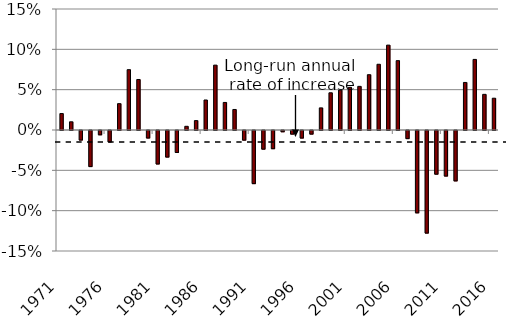
| Category | Series 0 |
|---|---|
| 1971.0 | 0.02 |
| nan | 0.014 |
| nan | 0.011 |
| nan | 0.015 |
| nan | 0.013 |
| nan | 0.014 |
| nan | 0.016 |
| nan | 0.007 |
| nan | 0.005 |
| nan | 0.005 |
| nan | 0.013 |
| nan | 0.009 |
| 1972.0 | 0.01 |
| nan | 0.013 |
| nan | 0.012 |
| nan | 0.01 |
| nan | 0.009 |
| nan | 0.009 |
| nan | 0.016 |
| nan | 0.016 |
| nan | 0.011 |
| nan | 0.004 |
| nan | -0.005 |
| nan | -0.004 |
| 1973.0 | -0.012 |
| nan | -0.016 |
| nan | -0.022 |
| nan | -0.027 |
| nan | -0.033 |
| nan | -0.041 |
| nan | -0.048 |
| nan | -0.058 |
| nan | -0.054 |
| nan | -0.05 |
| nan | -0.05 |
| nan | -0.049 |
| 1974.0 | -0.045 |
| nan | -0.043 |
| nan | -0.036 |
| nan | -0.03 |
| nan | -0.033 |
| nan | -0.031 |
| nan | -0.031 |
| nan | -0.025 |
| nan | -0.029 |
| nan | -0.029 |
| nan | -0.028 |
| nan | -0.02 |
| 1975.0 | -0.005 |
| nan | -0.007 |
| nan | -0.006 |
| nan | -0.007 |
| nan | -0.003 |
| nan | -0.008 |
| nan | -0.011 |
| nan | -0.003 |
| nan | 0.003 |
| nan | 0.007 |
| nan | 0.007 |
| nan | -0.002 |
| 1976.0 | -0.014 |
| nan | -0.01 |
| nan | -0.002 |
| nan | 0.007 |
| nan | 0.015 |
| nan | 0.021 |
| nan | 0.03 |
| nan | 0.027 |
| nan | 0.026 |
| nan | 0.022 |
| nan | 0.027 |
| nan | 0.033 |
| 1977.0 | 0.033 |
| nan | 0.035 |
| nan | 0.036 |
| nan | 0.039 |
| nan | 0.042 |
| nan | 0.045 |
| nan | 0.047 |
| nan | 0.053 |
| nan | 0.059 |
| nan | 0.07 |
| nan | 0.072 |
| nan | 0.073 |
| 1978.0 | 0.075 |
| nan | 0.079 |
| nan | 0.077 |
| nan | 0.072 |
| nan | 0.069 |
| nan | 0.073 |
| nan | 0.074 |
| nan | 0.077 |
| nan | 0.069 |
| nan | 0.06 |
| nan | 0.06 |
| nan | 0.062 |
| 1979.0 | 0.063 |
| nan | 0.058 |
| nan | 0.056 |
| nan | 0.052 |
| nan | 0.048 |
| nan | 0.045 |
| nan | 0.038 |
| nan | 0.029 |
| nan | 0.024 |
| nan | 0.024 |
| nan | 0.016 |
| nan | 0.004 |
| 1980.0 | -0.009 |
| nan | -0.018 |
| nan | -0.028 |
| nan | -0.031 |
| nan | -0.035 |
| nan | -0.041 |
| nan | -0.034 |
| nan | -0.036 |
| nan | -0.037 |
| nan | -0.043 |
| nan | -0.045 |
| nan | -0.046 |
| 1981.0 | -0.042 |
| nan | -0.039 |
| nan | -0.034 |
| nan | -0.03 |
| nan | -0.028 |
| nan | -0.026 |
| nan | -0.038 |
| nan | -0.039 |
| nan | -0.043 |
| nan | -0.039 |
| nan | -0.038 |
| nan | -0.035 |
| 1982.0 | -0.033 |
| nan | -0.028 |
| nan | -0.027 |
| nan | -0.032 |
| nan | -0.039 |
| nan | -0.048 |
| nan | -0.048 |
| nan | -0.048 |
| nan | -0.042 |
| nan | -0.044 |
| nan | -0.039 |
| nan | -0.031 |
| 1983.0 | -0.027 |
| nan | -0.022 |
| nan | -0.018 |
| nan | -0.018 |
| nan | -0.011 |
| nan | 0.003 |
| nan | 0.011 |
| nan | 0.015 |
| nan | 0.014 |
| nan | 0.016 |
| nan | 0.013 |
| nan | 0.009 |
| 1984.0 | 0.005 |
| nan | -0.001 |
| nan | -0.003 |
| nan | 0 |
| nan | 0.005 |
| nan | 0.006 |
| nan | 0.006 |
| nan | 0.005 |
| nan | 0.006 |
| nan | 0.006 |
| nan | 0.006 |
| nan | 0.007 |
| 1985.0 | 0.012 |
| nan | 0.013 |
| nan | 0.012 |
| nan | 0.014 |
| nan | 0.014 |
| nan | 0.016 |
| nan | 0.019 |
| nan | 0.024 |
| nan | 0.029 |
| nan | 0.032 |
| nan | 0.035 |
| nan | 0.035 |
| 1986.0 | 0.037 |
| nan | 0.046 |
| nan | 0.057 |
| nan | 0.067 |
| nan | 0.07 |
| nan | 0.07 |
| nan | 0.075 |
| nan | 0.076 |
| nan | 0.076 |
| nan | 0.078 |
| nan | 0.08 |
| nan | 0.084 |
| 1987.0 | 0.08 |
| nan | 0.074 |
| nan | 0.062 |
| nan | 0.053 |
| nan | 0.051 |
| nan | 0.054 |
| nan | 0.049 |
| nan | 0.044 |
| nan | 0.041 |
| nan | 0.038 |
| nan | 0.036 |
| nan | 0.033 |
| 1988.0 | 0.034 |
| nan | 0.034 |
| nan | 0.035 |
| nan | 0.034 |
| nan | 0.034 |
| nan | 0.032 |
| nan | 0.031 |
| nan | 0.031 |
| nan | 0.03 |
| nan | 0.029 |
| nan | 0.029 |
| nan | 0.027 |
| 1989.0 | 0.025 |
| nan | 0.024 |
| nan | 0.022 |
| nan | 0.02 |
| nan | 0.015 |
| nan | 0.013 |
| nan | 0.01 |
| nan | 0.009 |
| nan | 0.009 |
| nan | 0.005 |
| nan | 0.001 |
| nan | -0.003 |
| 1990.0 | -0.012 |
| nan | -0.016 |
| nan | -0.019 |
| nan | -0.017 |
| nan | -0.016 |
| nan | -0.022 |
| nan | -0.027 |
| nan | -0.038 |
| nan | -0.048 |
| nan | -0.054 |
| nan | -0.061 |
| nan | -0.064 |
| 1991.0 | -0.066 |
| nan | -0.067 |
| nan | -0.067 |
| nan | -0.068 |
| nan | -0.066 |
| nan | -0.06 |
| nan | -0.055 |
| nan | -0.048 |
| nan | -0.041 |
| nan | -0.036 |
| nan | -0.033 |
| nan | -0.031 |
| 1992.0 | -0.023 |
| nan | -0.022 |
| nan | -0.022 |
| nan | -0.021 |
| nan | -0.021 |
| nan | -0.026 |
| nan | -0.028 |
| nan | -0.029 |
| nan | -0.028 |
| nan | -0.027 |
| nan | -0.023 |
| nan | -0.02 |
| 1993.0 | -0.023 |
| nan | -0.023 |
| nan | -0.023 |
| nan | -0.024 |
| nan | -0.023 |
| nan | -0.017 |
| nan | -0.012 |
| nan | -0.009 |
| nan | -0.006 |
| nan | -0.007 |
| nan | -0.006 |
| nan | -0.006 |
| 1994.0 | -0.002 |
| nan | -0.001 |
| nan | 0.001 |
| nan | 0.003 |
| nan | 0.005 |
| nan | 0.003 |
| nan | 0 |
| nan | -0.001 |
| nan | -0.002 |
| nan | 0.001 |
| nan | -0.001 |
| nan | -0.002 |
| 1995.0 | -0.004 |
| nan | -0.006 |
| nan | -0.006 |
| nan | -0.009 |
| nan | -0.013 |
| nan | -0.013 |
| nan | -0.01 |
| nan | -0.009 |
| nan | -0.008 |
| nan | -0.01 |
| nan | -0.007 |
| nan | -0.007 |
| 1996.0 | -0.009 |
| nan | -0.009 |
| nan | -0.008 |
| nan | -0.007 |
| nan | -0.005 |
| nan | -0.003 |
| nan | -0.005 |
| nan | -0.004 |
| nan | -0.006 |
| nan | -0.006 |
| nan | -0.009 |
| nan | -0.009 |
| 1997.0 | -0.004 |
| nan | -0.003 |
| nan | 0 |
| nan | 0.002 |
| nan | 0.005 |
| nan | 0.005 |
| nan | 0.007 |
| nan | 0.008 |
| nan | 0.009 |
| nan | 0.012 |
| nan | 0.018 |
| nan | 0.023 |
| 1998.0 | 0.027 |
| nan | 0.03 |
| nan | 0.033 |
| nan | 0.035 |
| nan | 0.036 |
| nan | 0.039 |
| nan | 0.041 |
| nan | 0.044 |
| nan | 0.047 |
| nan | 0.049 |
| nan | 0.048 |
| nan | 0.047 |
| 1999.0 | 0.046 |
| nan | 0.047 |
| nan | 0.047 |
| nan | 0.043 |
| nan | 0.045 |
| nan | 0.048 |
| nan | 0.047 |
| nan | 0.047 |
| nan | 0.045 |
| nan | 0.048 |
| nan | 0.048 |
| nan | 0.049 |
| 2000.0 | 0.049 |
| nan | 0.047 |
| nan | 0.044 |
| nan | 0.053 |
| nan | 0.053 |
| nan | 0.049 |
| nan | 0.049 |
| nan | 0.052 |
| nan | 0.052 |
| nan | 0.053 |
| nan | 0.055 |
| nan | 0.057 |
| 2001.0 | 0.053 |
| nan | 0.053 |
| nan | 0.057 |
| nan | 0.051 |
| nan | 0.044 |
| nan | 0.046 |
| nan | 0.052 |
| nan | 0.051 |
| nan | 0.05 |
| nan | 0.051 |
| nan | 0.05 |
| nan | 0.05 |
| 2002.0 | 0.054 |
| nan | 0.054 |
| nan | 0.053 |
| nan | 0.054 |
| nan | 0.064 |
| nan | 0.069 |
| nan | 0.067 |
| nan | 0.065 |
| nan | 0.071 |
| nan | 0.069 |
| nan | 0.07 |
| nan | 0.07 |
| 2003.0 | 0.069 |
| nan | 0.066 |
| nan | 0.064 |
| nan | 0.071 |
| nan | 0.069 |
| nan | 0.066 |
| nan | 0.066 |
| nan | 0.067 |
| nan | 0.068 |
| nan | 0.072 |
| nan | 0.077 |
| nan | 0.078 |
| 2004.0 | 0.081 |
| nan | 0.088 |
| nan | 0.095 |
| nan | 0.095 |
| nan | 0.092 |
| nan | 0.094 |
| nan | 0.099 |
| nan | 0.102 |
| nan | 0.104 |
| nan | 0.098 |
| nan | 0.096 |
| nan | 0.101 |
| 2005.0 | 0.105 |
| nan | 0.107 |
| nan | 0.107 |
| nan | 0.104 |
| nan | 0.112 |
| nan | 0.115 |
| nan | 0.108 |
| nan | 0.104 |
| nan | 0.094 |
| nan | 0.096 |
| nan | 0.103 |
| nan | 0.098 |
| 2006.0 | 0.086 |
| nan | 0.082 |
| nan | 0.074 |
| nan | 0.062 |
| nan | 0.044 |
| nan | 0.028 |
| nan | 0.018 |
| nan | 0.01 |
| nan | 0.016 |
| nan | 0.016 |
| nan | 0.002 |
| nan | -0.008 |
| 2007.0 | -0.01 |
| nan | -0.018 |
| nan | -0.03 |
| nan | -0.033 |
| nan | -0.039 |
| nan | -0.042 |
| nan | -0.042 |
| nan | -0.041 |
| nan | -0.054 |
| nan | -0.068 |
| nan | -0.085 |
| nan | -0.091 |
| 2008.0 | -0.102 |
| nan | -0.109 |
| nan | -0.114 |
| nan | -0.116 |
| nan | -0.118 |
| nan | -0.126 |
| nan | -0.133 |
| nan | -0.135 |
| nan | -0.139 |
| nan | -0.135 |
| nan | -0.118 |
| nan | -0.121 |
| 2009.0 | -0.127 |
| nan | -0.13 |
| nan | -0.124 |
| nan | -0.115 |
| nan | -0.101 |
| nan | -0.087 |
| nan | -0.071 |
| nan | -0.069 |
| nan | -0.064 |
| nan | -0.065 |
| nan | -0.069 |
| nan | -0.064 |
| 2010.0 | -0.054 |
| nan | -0.051 |
| nan | -0.042 |
| nan | -0.032 |
| nan | -0.028 |
| nan | -0.025 |
| nan | -0.033 |
| nan | -0.039 |
| nan | -0.045 |
| nan | -0.048 |
| nan | -0.052 |
| nan | -0.055 |
| 2011.0 | -0.056 |
| nan | -0.057 |
| nan | -0.065 |
| nan | -0.072 |
| nan | -0.076 |
| nan | -0.072 |
| nan | -0.069 |
| nan | -0.067 |
| nan | -0.067 |
| nan | -0.066 |
| nan | -0.068 |
| nan | -0.067 |
| 2012.0 | -0.062 |
| nan | -0.054 |
| nan | -0.039 |
| nan | -0.027 |
| nan | -0.014 |
| nan | -0.008 |
| nan | 0 |
| nan | 0.004 |
| nan | 0.01 |
| nan | 0.018 |
| nan | 0.036 |
| nan | 0.047 |
| 2013.0 | 0.059 |
| nan | 0.062 |
| nan | 0.073 |
| nan | 0.079 |
| nan | 0.076 |
| nan | 0.074 |
| nan | 0.076 |
| nan | 0.085 |
| nan | 0.093 |
| nan | 0.098 |
| nan | 0.094 |
| nan | 0.091 |
| 2014.0 | 0.088 |
| nan | 0.089 |
| nan | 0.074 |
| nan | 0.059 |
| nan | 0.048 |
| nan | 0.041 |
| nan | 0.035 |
| nan | 0.033 |
| nan | 0.03 |
| nan | 0.029 |
| nan | 0.032 |
| nan | 0.037 |
| 2015.0 | 0.044 |
| nan | 0.043 |
| nan | 0.044 |
| nan | 0.045 |
| nan | 0.044 |
| nan | 0.043 |
| nan | 0.043 |
| nan | 0.043 |
| nan | 0.048 |
| nan | 0.048 |
| nan | 0.046 |
| nan | 0.045 |
| 2016.0 | 0.039 |
| nan | 0.042 |
| nan | 0.042 |
| nan | 0.039 |
| nan | 0.04 |
| nan | 0.039 |
| nan | 0.042 |
| nan | 0.042 |